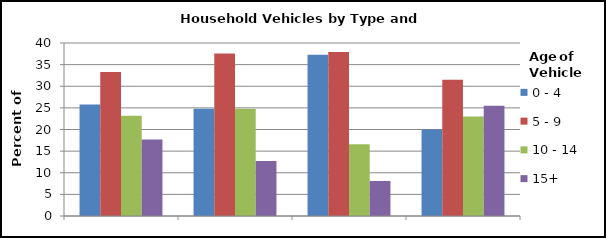
| Category | 0 - 4 | 5 - 9 | 10 - 14 | 15+ |
|---|---|---|---|---|
|  | 25.8 | 33.3 | 23.2 | 17.7 |
|  | 24.8 | 37.6 | 24.8 | 12.7 |
|  | 37.3 | 37.9 | 16.6 | 8.1 |
|  | 20 | 31.5 | 23 | 25.5 |